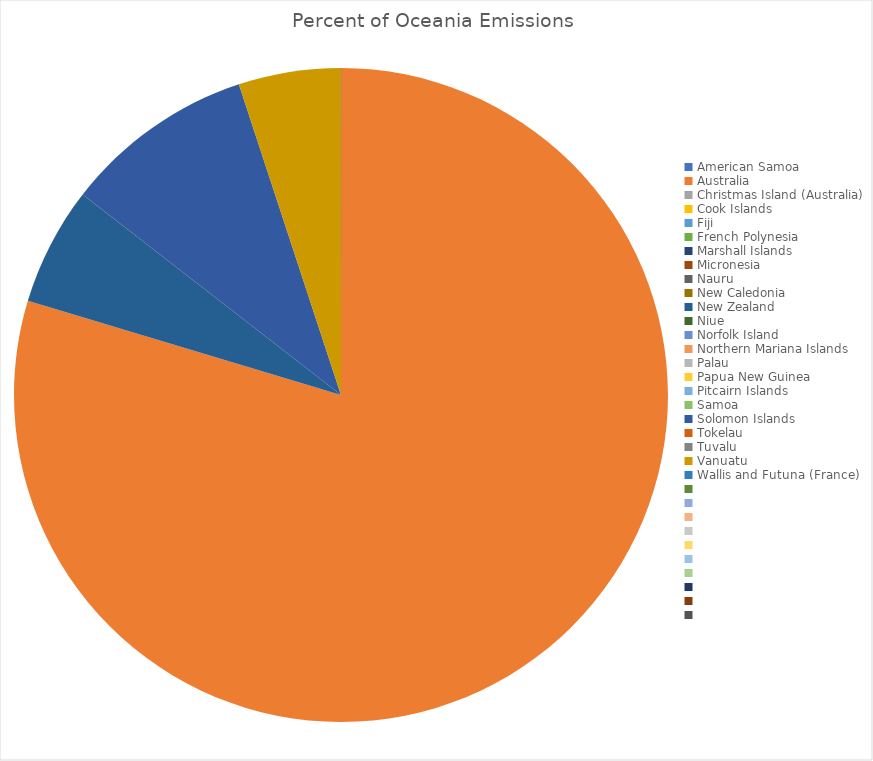
| Category | Percent of Oceania Emissions  |
|---|---|
| American Samoa | 0 |
| Australia | 0.796 |
| Christmas Island (Australia) | 0 |
| Cook Islands | 0 |
| Fiji | 0 |
| French Polynesia | 0 |
| Marshall Islands | 0 |
| Micronesia | 0 |
| Nauru | 0 |
| New Caledonia | 0 |
| New Zealand | 0.059 |
| Niue | 0 |
| Norfolk Island | 0 |
| Northern Mariana Islands | 0 |
| Palau | 0 |
| Papua New Guinea | 0 |
| Pitcairn Islands | 0 |
| Samoa | 0 |
| Solomon Islands | 0.094 |
| Tokelau | 0 |
| Tuvalu | 0 |
| Vanuatu | 0.051 |
| Wallis and Futuna (France) | 0 |